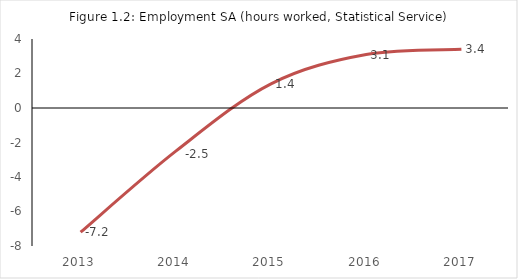
| Category | Employment SA (hours worked, Statistical Service) |
|---|---|
| 2013.0 | -7.2 |
| 2014.0 | -2.5 |
| 2015.0 | 1.4 |
| 2016.0 | 3.1 |
| 2017.0 | 3.4 |